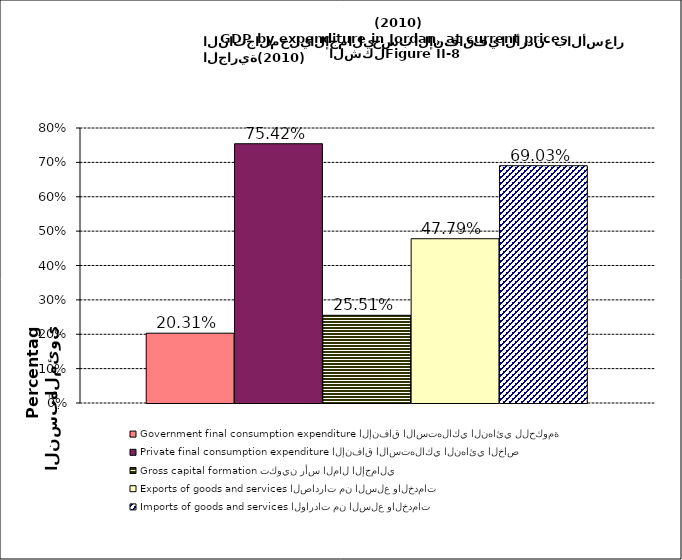
| Category | Government final consumption expenditure الإنفاق الاستهلاكي النهائي للحكومة | Private final consumption expenditure الإنفاق الاستهلاكي النهائي الخاص | Gross capital formation تكوين رأس المال الإجمالي | Exports of goods and services الصادرات من السلع والخدمات | Imports of goods and services الواردات من السلع والخدمات |
|---|---|---|---|---|---|
| 0 | 0.203 | 0.754 | 0.255 | 0.478 | 0.69 |